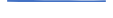
| Category | Series 0 |
|---|---|
| 0 | 248 |
| 1 | 220 |
| 2 | 179 |
| 3 | 159 |
| 4 | 165 |
| 5 | 155 |
| 6 | 121 |
| 7 | 117 |
| 8 | 133 |